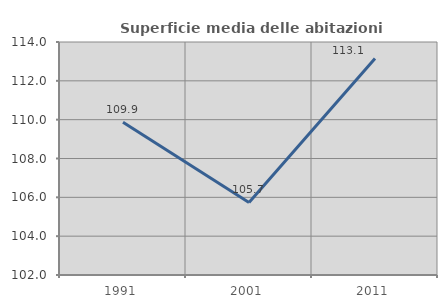
| Category | Superficie media delle abitazioni occupate |
|---|---|
| 1991.0 | 109.872 |
| 2001.0 | 105.737 |
| 2011.0 | 113.148 |